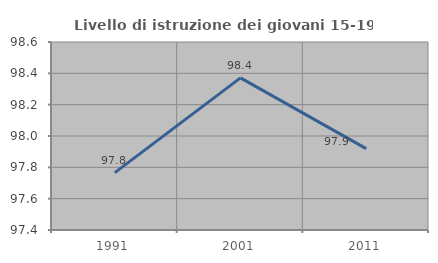
| Category | Livello di istruzione dei giovani 15-19 anni |
|---|---|
| 1991.0 | 97.766 |
| 2001.0 | 98.371 |
| 2011.0 | 97.92 |